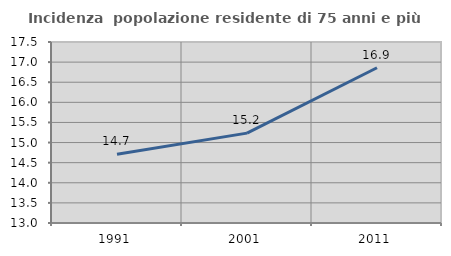
| Category | Incidenza  popolazione residente di 75 anni e più |
|---|---|
| 1991.0 | 14.712 |
| 2001.0 | 15.235 |
| 2011.0 | 16.859 |